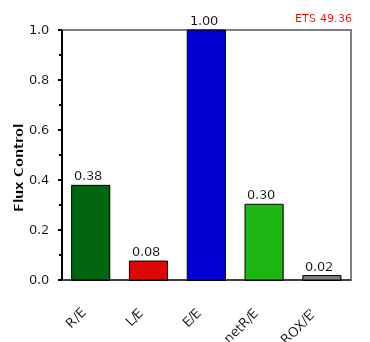
| Category | ETS 49,36 |
|---|---|
| R/E | 0.379 |
| L/E | 0.076 |
| E/E | 1 |
| netR/E | 0.303 |
| ROX/E' | 0.018 |